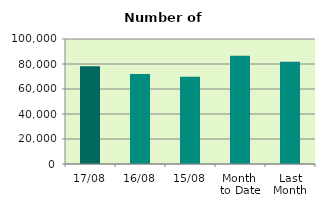
| Category | Series 0 |
|---|---|
| 17/08 | 78236 |
| 16/08 | 72062 |
| 15/08 | 69862 |
| Month 
to Date | 86648.615 |
| Last
Month | 81818 |